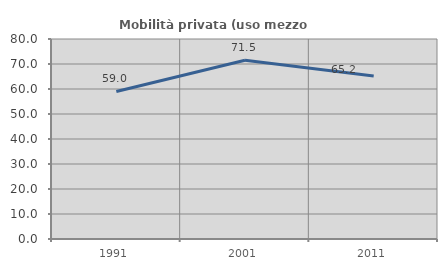
| Category | Mobilità privata (uso mezzo privato) |
|---|---|
| 1991.0 | 59.016 |
| 2001.0 | 71.508 |
| 2011.0 | 65.168 |